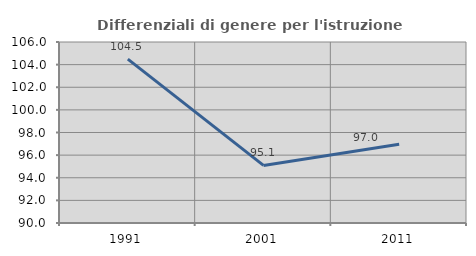
| Category | Differenziali di genere per l'istruzione superiore |
|---|---|
| 1991.0 | 104.482 |
| 2001.0 | 95.091 |
| 2011.0 | 96.954 |